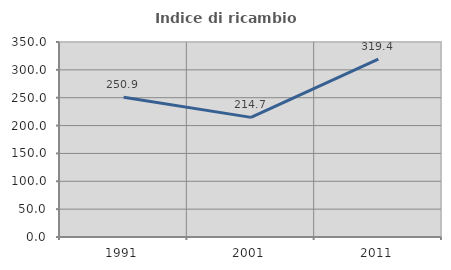
| Category | Indice di ricambio occupazionale  |
|---|---|
| 1991.0 | 250.926 |
| 2001.0 | 214.706 |
| 2011.0 | 319.417 |